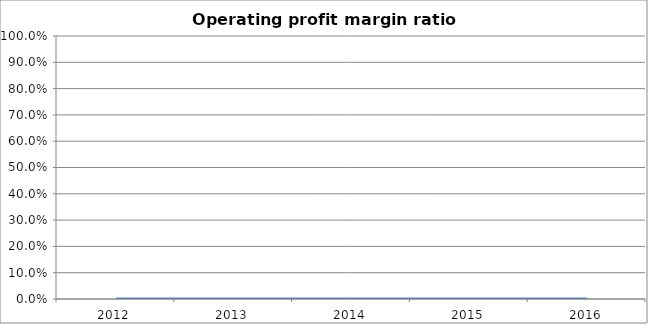
| Category | Operating profit margin ratio [(I+K-O/H] |
|---|---|
| 2012.0 | 0 |
| 2013.0 | 0 |
| 2014.0 | 0 |
| 2015.0 | 0 |
| 2016.0 | 0 |